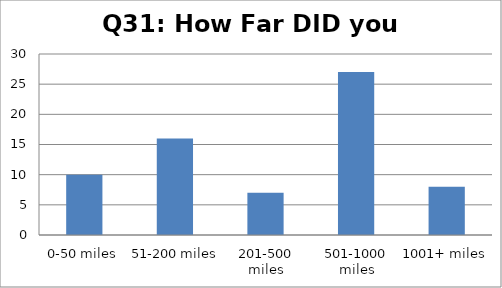
| Category | Series 0 |
|---|---|
| 0-50 miles | 10 |
| 51-200 miles | 16 |
| 201-500 miles | 7 |
| 501-1000 miles | 27 |
| 1001+ miles | 8 |